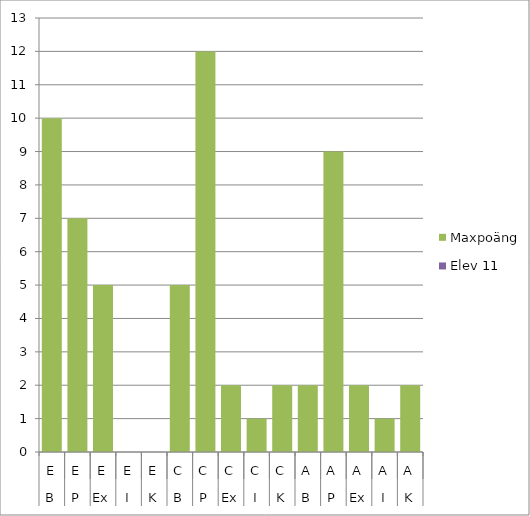
| Category | Maxpoäng | Elev 11 |
|---|---|---|
| 0 | 10 | 0 |
| 1 | 7 | 0 |
| 2 | 5 | 0 |
| 3 | 0 | 0 |
| 4 | 0 | 0 |
| 5 | 5 | 0 |
| 6 | 12 | 0 |
| 7 | 2 | 0 |
| 8 | 1 | 0 |
| 9 | 2 | 0 |
| 10 | 2 | 0 |
| 11 | 9 | 0 |
| 12 | 2 | 0 |
| 13 | 1 | 0 |
| 14 | 2 | 0 |